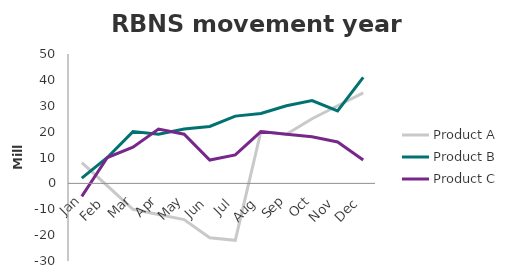
| Category | Product A | Product B | Product C |
|---|---|---|---|
| Jan | 8 | 2 | -5 |
| Feb | -1 | 10 | 10 |
| Mar | -10 | 20 | 14 |
| Apr | -12 | 19 | 21 |
| May | -14 | 21 | 19 |
| Jun | -21 | 22 | 9 |
| Jul | -22 | 26 | 11 |
| Aug | 20 | 27 | 20 |
| Sep | 19 | 30 | 19 |
| Oct | 25 | 32 | 18 |
| Nov | 30 | 28 | 16 |
| Dec | 35 | 41 | 9 |